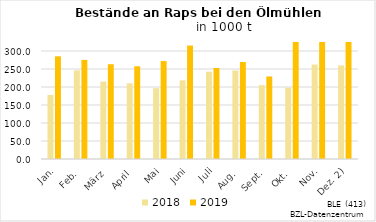
| Category | 2018 | 2019 |
|---|---|---|
| Jan. | 178.034 | 285.243 |
| Feb. | 246.243 | 275.267 |
| März | 214.941 | 263.235 |
| April | 210.197 | 257.584 |
| Mai | 196.708 | 272.142 |
| Juni | 218.409 | 315.109 |
| Juli | 242.467 | 252.713 |
| Aug. | 245.8 | 269.422 |
| Sept. | 205.112 | 229.272 |
| Okt. | 198.01 | 338.56 |
| Nov. | 262.306 | 376.4 |
| Dez. 2) | 259.981 | 337.884 |